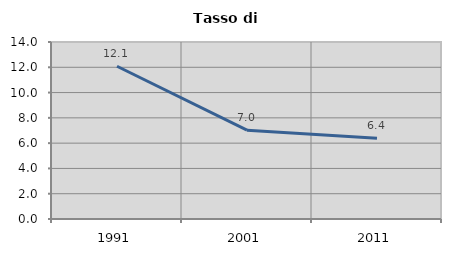
| Category | Tasso di disoccupazione   |
|---|---|
| 1991.0 | 12.08 |
| 2001.0 | 7.029 |
| 2011.0 | 6.383 |